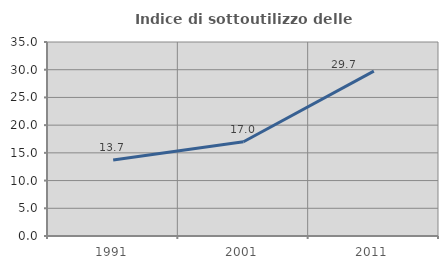
| Category | Indice di sottoutilizzo delle abitazioni  |
|---|---|
| 1991.0 | 13.721 |
| 2001.0 | 17 |
| 2011.0 | 29.737 |